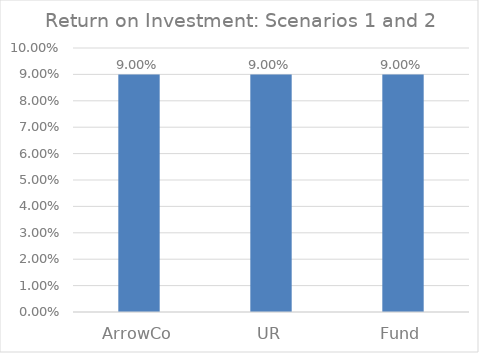
| Category | Series 0 |
|---|---|
| ArrowCo | 0.09 |
| UR | 0.09 |
| Fund | 0.09 |